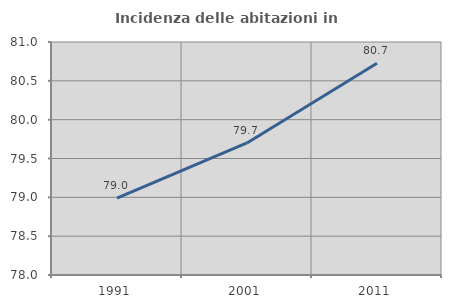
| Category | Incidenza delle abitazioni in proprietà  |
|---|---|
| 1991.0 | 78.989 |
| 2001.0 | 79.7 |
| 2011.0 | 80.726 |